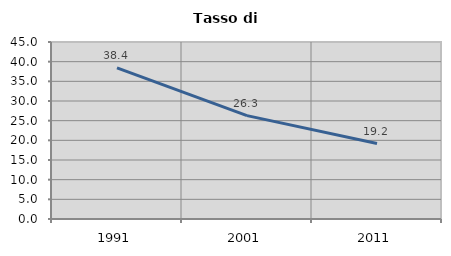
| Category | Tasso di disoccupazione   |
|---|---|
| 1991.0 | 38.42 |
| 2001.0 | 26.288 |
| 2011.0 | 19.189 |